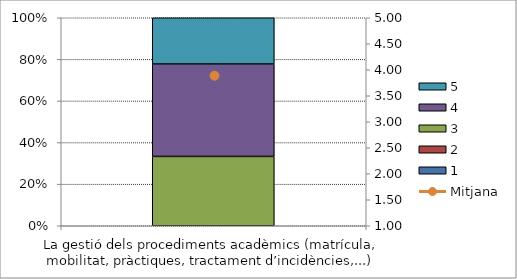
| Category | 1 | 2 | 3 | 4 | 5 |
|---|---|---|---|---|---|
| La gestió dels procediments acadèmics (matrícula, mobilitat, pràctiques, tractament d’incidències,...) | 0 | 0 | 3 | 4 | 2 |